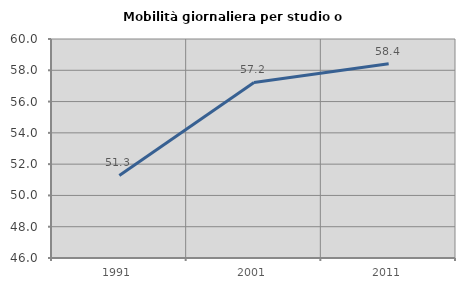
| Category | Mobilità giornaliera per studio o lavoro |
|---|---|
| 1991.0 | 51.274 |
| 2001.0 | 57.223 |
| 2011.0 | 58.411 |